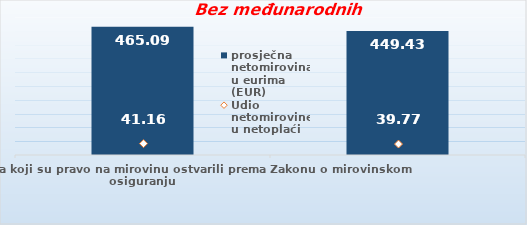
| Category | prosječna netomirovina u eurima (EUR) |
|---|---|
| Korisnici mirovina koji su pravo na mirovinu ostvarili prema Zakonu o mirovinskom osiguranju  | 465.09 |
| Korisnici koji su pravo na mirovinu PRVI PUT ostvarili u 2023. godini prema Zakonu o mirovinskom osiguranju - NOVI KORISNICI | 449.426 |